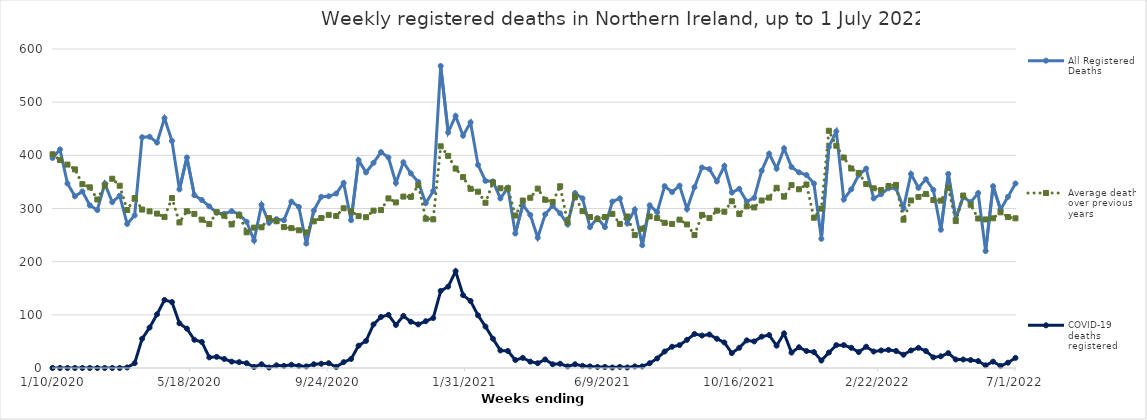
| Category | All Registered Deaths | Average deaths over previous 5 years | COVID-19 deaths registered |
|---|---|---|---|
| 1/10/20 | 395 | 402 | 0 |
| 1/17/20 | 411 | 391 | 0 |
| 1/24/20 | 347 | 382.6 | 0 |
| 1/31/20 | 323 | 373.6 | 0 |
| 2/7/20 | 332 | 345.8 | 0 |
| 2/14/20 | 306 | 339.8 | 0 |
| 2/21/20 | 297 | 317 | 0 |
| 2/28/20 | 347 | 343 | 0 |
| 3/6/20 | 312 | 356 | 0 |
| 3/13/20 | 324 | 342.8 | 0 |
| 3/20/20 | 271 | 297.2 | 1 |
| 3/27/20 | 287 | 319.6 | 9 |
| 4/3/20 | 434 | 298 | 55 |
| 4/10/20 | 435 | 294.6 | 76 |
| 4/17/20 | 424 | 290.4 | 101 |
| 4/24/20 | 470 | 283.8 | 128 |
| 5/1/20 | 427 | 319.6 | 124 |
| 5/8/20 | 336 | 273.8 | 84 |
| 5/15/20 | 396 | 294.8 | 74 |
| 5/22/20 | 325 | 289.8 | 53 |
| 5/29/20 | 316 | 279 | 49 |
| 6/5/20 | 304 | 270.6 | 20 |
| 6/12/20 | 292 | 293.2 | 21 |
| 6/19/20 | 290 | 286.4 | 17 |
| 6/26/20 | 295 | 270 | 12 |
| 7/3/20 | 289 | 288.2 | 11 |
| 7/10/20 | 275 | 255.2 | 9 |
| 7/17/20 | 240 | 264 | 2 |
| 7/24/20 | 307 | 264.6 | 7 |
| 7/31/20 | 273 | 282 | 1 |
| 8/7/20 | 280 | 276 | 5 |
| 8/14/20 | 278 | 265 | 4 |
| 8/21/20 | 313 | 263 | 6 |
| 8/28/20 | 303 | 259 | 4 |
| 9/4/20 | 234 | 255 | 3 |
| 9/11/20 | 296 | 276 | 7 |
| 9/18/20 | 322 | 282 | 8 |
| 9/25/20 | 323 | 288 | 9 |
| 10/2/20 | 328 | 286 | 2 |
| 10/9/20 | 348 | 300.4 | 11 |
| 10/16/20 | 278 | 294.8 | 17 |
| 10/23/20 | 391 | 285.6 | 42 |
| 10/30/20 | 368 | 283.6 | 51 |
| 11/6/20 | 386 | 296 | 82 |
| 11/13/20 | 406 | 297 | 96 |
| 11/20/20 | 396 | 319 | 100 |
| 11/27/20 | 348 | 311.4 | 81 |
| 12/4/20 | 387 | 322.4 | 98 |
| 12/11/20 | 366 | 321.8 | 87 |
| 12/18/20 | 350 | 343.8 | 82 |
| 12/25/20 | 310 | 280.8 | 88 |
| 1/1/21 | 333 | 279.6 | 94 |
| 1/8/21 | 568 | 417 | 145 |
| 1/15/21 | 443 | 399 | 153 |
| 1/22/21 | 474 | 375 | 182 |
| 1/29/21 | 437 | 359 | 137 |
| 2/5/21 | 462 | 337 | 126 |
| 2/12/21 | 382 | 331.6 | 99 |
| 2/19/21 | 352 | 310.8 | 78 |
| 2/26/21 | 351 | 349 | 55 |
| 3/5/21 | 319 | 338 | 33 |
| 3/12/21 | 339 | 338 | 32 |
| 3/19/21 | 253 | 286.8 | 15 |
| 3/26/21 | 307 | 315 | 19 |
| 4/2/21 | 288 | 320.2 | 12 |
| 4/9/21 | 245 | 337.4 | 9 |
| 4/16/21 | 289 | 316.4 | 16 |
| 4/23/21 | 305 | 312.4 | 7 |
| 4/30/21 | 291 | 341.8 | 8 |
| 5/7/21 | 270 | 274 | 3 |
| 5/14/21 | 329 | 323 | 7 |
| 5/21/21 | 319 | 295 | 4 |
| 5/28/21 | 265 | 284 | 3 |
| 6/4/21 | 282 | 280 | 2 |
| 6/11/21 | 265 | 284 | 2 |
| 6/18/21 | 313 | 290 | 1 |
| 6/25/21 | 319 | 271 | 2 |
| 7/2/21 | 272 | 285 | 1 |
| 7/9/21 | 298 | 250 | 3 |
| 7/16/21 | 231 | 262 | 3 |
| 7/23/21 | 306 | 285 | 9 |
| 7/30/21 | 293 | 282 | 18 |
| 8/6/21 | 342 | 273 | 31 |
| 8/13/21 | 331 | 271 | 40 |
| 8/20/21 | 343 | 279 | 43 |
| 8/27/21 | 299 | 270 | 53 |
| 9/3/21 | 340 | 250 | 64 |
| 9/10/21 | 377 | 288 | 61 |
| 9/17/21 | 374 | 282 | 63 |
| 9/24/21 | 351 | 296 | 55 |
| 10/1/21 | 380 | 294 | 48 |
| 10/8/21 | 330 | 313.6 | 28 |
| 10/15/21 | 337 | 289.6 | 38 |
| 10/22/21 | 313 | 304 | 52 |
| 10/29/21 | 320 | 302 | 50 |
| 11/5/21 | 371 | 315 | 59 |
| 11/12/21 | 403 | 320.4 | 62 |
| 11/19/21 | 375 | 339 | 42 |
| 11/26/21 | 413 | 322.2 | 65 |
| 12/3/21 | 378 | 344 | 29 |
| 12/10/21 | 368 | 336.2 | 39 |
| 12/17/21 | 363 | 345.2 | 32 |
| 12/24/21 | 347 | 282.6 | 30 |
| 12/31/21 | 243 | 299.8 | 14 |
| 1/7/22 | 416 | 446.2 | 29 |
| 1/14/22 | 445 | 418 | 43 |
| 1/21/22 | 317 | 395.8 | 43 |
| 1/28/22 | 336 | 375.2 | 38 |
| 2/4/22 | 363 | 367 | 30 |
| 2/11/22 | 375 | 346 | 40 |
| 2/18/22 | 319 | 338 | 31 |
| 2/25/22 | 327 | 334.6 | 33 |
| 3/4/22 | 338 | 342.4 | 34 |
| 3/11/22 | 338 | 344.4 | 32 |
| 3/18/22 | 301 | 279 | 25 |
| 3/25/22 | 365 | 315.2 | 33 |
| 4/1/22 | 339 | 321.8 | 38 |
| 4/8/22 | 355 | 327.4 | 32 |
| 4/15/22 | 335 | 315.8 | 20 |
| 4/22/22 | 260 | 314.8 | 22 |
| 4/29/22 | 365 | 338.8 | 28 |
| 5/6/22 | 281 | 276.4 | 16 |
| 5/13/22 | 322 | 324.4 | 16 |
| 5/20/22 | 312 | 307 | 15 |
| 5/27/22 | 329 | 281.2 | 13 |
| 6/3/22 | 220 | 279.4 | 5 |
| 6/10/22 | 342 | 281.6 | 12 |
| 6/17/22 | 298 | 292.8 | 4 |
| 6/24/22 | 322 | 284 | 10 |
| 7/1/22 | 347 | 281.6 | 19 |